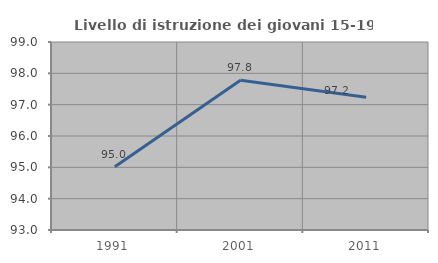
| Category | Livello di istruzione dei giovani 15-19 anni |
|---|---|
| 1991.0 | 95.019 |
| 2001.0 | 97.778 |
| 2011.0 | 97.235 |